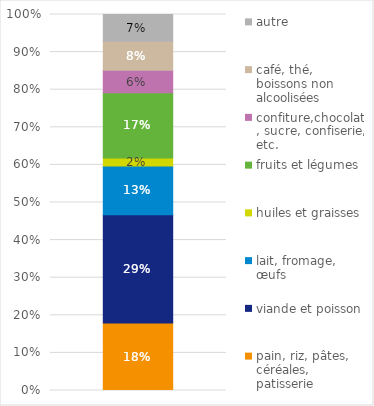
| Category | pain, riz, pâtes, céréales, patisserie | viande et poisson | lait, fromage, œufs | huiles et graisses | fruits et légumes | confiture,chocolat, sucre, confiserie, etc. | café, thé, boissons non alcoolisées | autre |
|---|---|---|---|---|---|---|---|---|
| 0 | 0.179 | 0.288 | 0.13 | 0.021 | 0.174 | 0.06 | 0.077 | 0.071 |